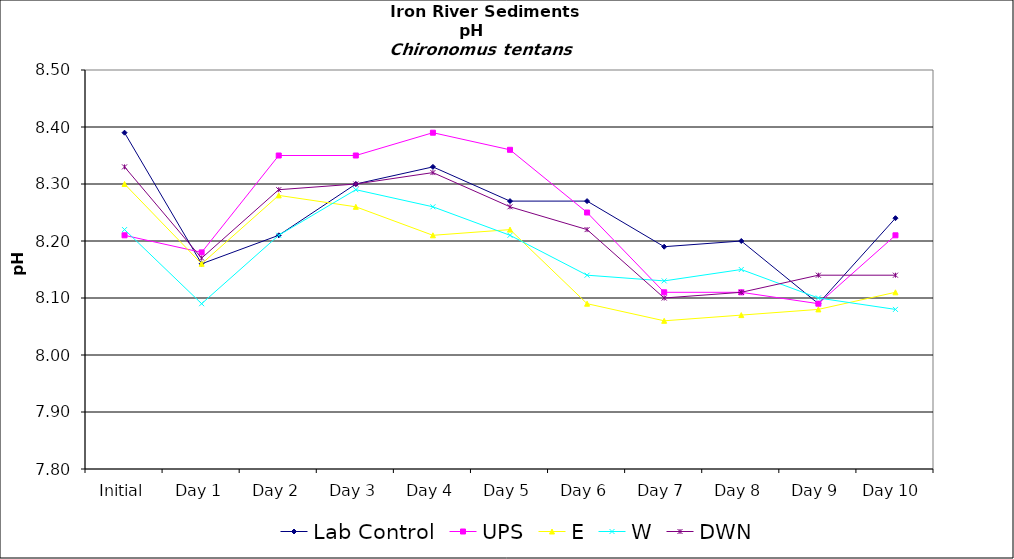
| Category | Lab Control | UPS | E | W | DWN |
|---|---|---|---|---|---|
| Initial | 8.39 | 8.21 | 8.3 | 8.22 | 8.33 |
| Day 1 | 8.16 | 8.18 | 8.16 | 8.09 | 8.17 |
| Day 2 | 8.21 | 8.35 | 8.28 | 8.21 | 8.29 |
| Day 3 | 8.3 | 8.35 | 8.26 | 8.29 | 8.3 |
| Day 4 | 8.33 | 8.39 | 8.21 | 8.26 | 8.32 |
| Day 5 | 8.27 | 8.36 | 8.22 | 8.21 | 8.26 |
| Day 6 | 8.27 | 8.25 | 8.09 | 8.14 | 8.22 |
| Day 7 | 8.19 | 8.11 | 8.06 | 8.13 | 8.1 |
| Day 8 | 8.2 | 8.11 | 8.07 | 8.15 | 8.11 |
| Day 9 | 8.09 | 8.09 | 8.08 | 8.1 | 8.14 |
| Day 10 | 8.24 | 8.21 | 8.11 | 8.08 | 8.14 |